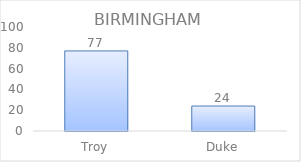
| Category | Series 0 |
|---|---|
| Troy | 77 |
| Duke | 24 |